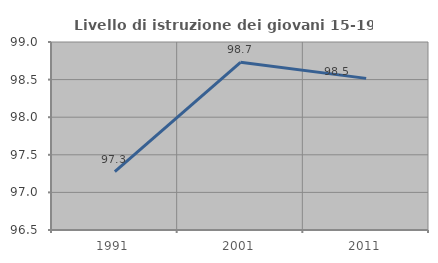
| Category | Livello di istruzione dei giovani 15-19 anni |
|---|---|
| 1991.0 | 97.277 |
| 2001.0 | 98.73 |
| 2011.0 | 98.516 |